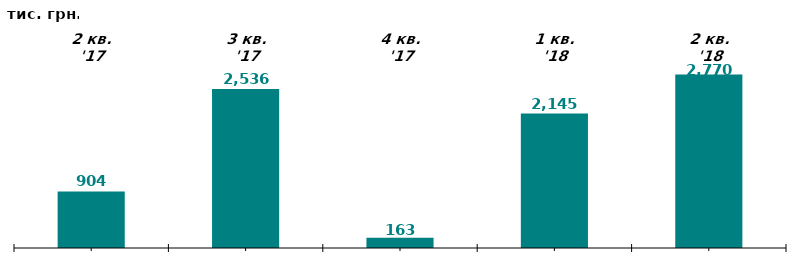
| Category | Series 1 |
|---|---|
| 2 кв. '17 | 903.571 |
| 3 кв. '17 | 2536.489 |
| 4 кв. '17 | 162.522 |
| 1 кв. '18 | 2145.214 |
| 2 кв. '18 | 2770.106 |